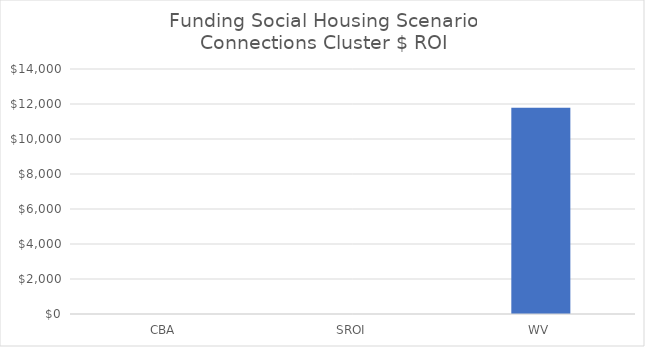
| Category | Connections |
|---|---|
| CBA | 0 |
| SROI | 0 |
| WV | 11784.4 |